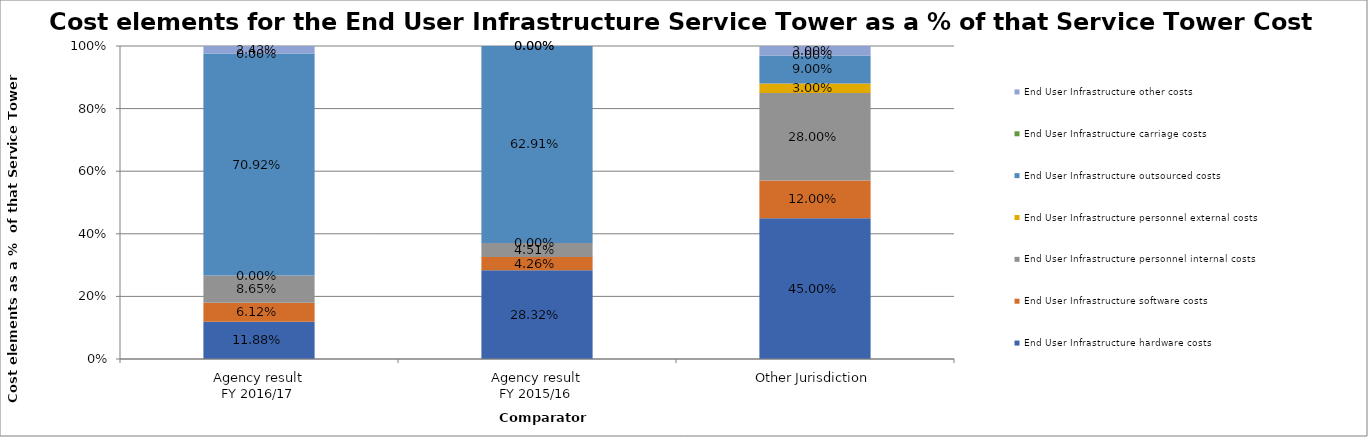
| Category | End User Infrastructure hardware costs | End User Infrastructure software costs | End User Infrastructure personnel internal costs | End User Infrastructure personnel external costs | End User Infrastructure outsourced costs | End User Infrastructure carriage costs | End User Infrastructure other costs |
|---|---|---|---|---|---|---|---|
| Agency result
FY 2016/17 | 0.119 | 0.061 | 0.086 | 0 | 0.709 | 0 | 0.024 |
| Agency result
FY 2015/16 | 0.283 | 0.043 | 0.045 | 0 | 0.629 | 0 | 0 |
| Other Jurisdiction | 0.45 | 0.12 | 0.28 | 0.03 | 0.09 | 0 | 0.03 |